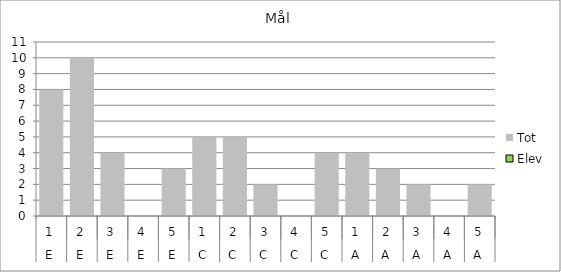
| Category | Tot | Elev |
|---|---|---|
| 0 | 8 | 0 |
| 1 | 10 | 0 |
| 2 | 4 | 0 |
| 3 | 0 | 0 |
| 4 | 3 | 0 |
| 5 | 5 | 0 |
| 6 | 5 | 0 |
| 7 | 2 | 0 |
| 8 | 0 | 0 |
| 9 | 4 | 0 |
| 10 | 4 | 0 |
| 11 | 3 | 0 |
| 12 | 2 | 0 |
| 13 | 0 | 0 |
| 14 | 2 | 0 |